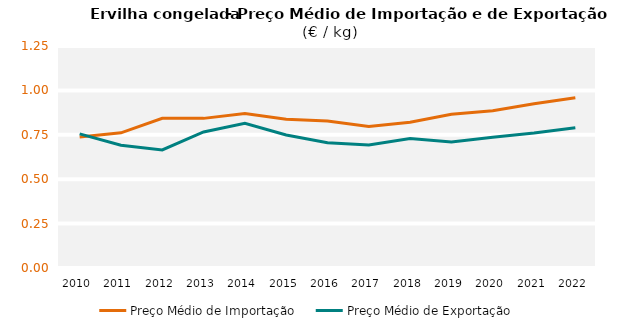
| Category | Preço Médio de Importação | Preço Médio de Exportação |
|---|---|---|
| 2010.0 | 0.738 | 0.755 |
| 2011.0 | 0.761 | 0.691 |
| 2012.0 | 0.843 | 0.665 |
| 2013.0 | 0.843 | 0.766 |
| 2014.0 | 0.869 | 0.814 |
| 2015.0 | 0.837 | 0.749 |
| 2016.0 | 0.828 | 0.705 |
| 2017.0 | 0.797 | 0.693 |
| 2018.0 | 0.821 | 0.729 |
| 2019.0 | 0.866 | 0.709 |
| 2020.0 | 0.885 | 0.736 |
| 2021.0 | 0.925 | 0.76 |
| 2022.0 | 0.958 | 0.79 |